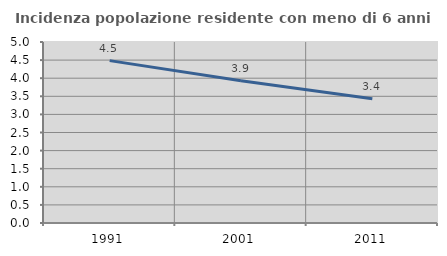
| Category | Incidenza popolazione residente con meno di 6 anni |
|---|---|
| 1991.0 | 4.485 |
| 2001.0 | 3.93 |
| 2011.0 | 3.43 |